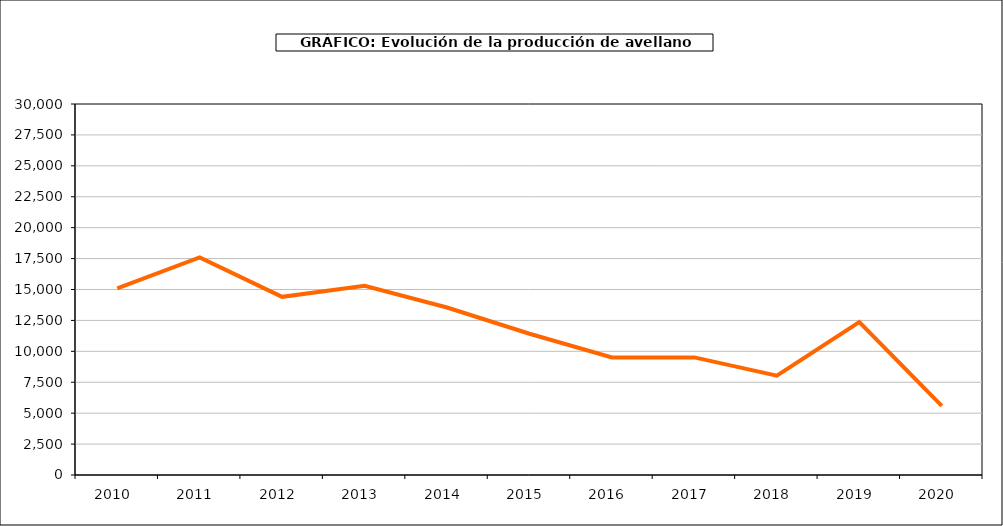
| Category | producción avellano |
|---|---|
| 2010.0 | 15086 |
| 2011.0 | 17590 |
| 2012.0 | 14406 |
| 2013.0 | 15302 |
| 2014.0 | 13544 |
| 2015.0 | 11423 |
| 2016.0 | 9510 |
| 2017.0 | 9510 |
| 2018.0 | 8033 |
| 2019.0 | 12371 |
| 2020.0 | 5587 |